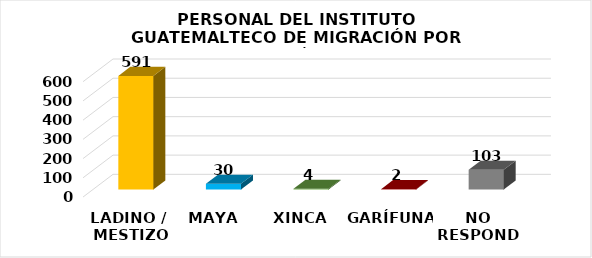
| Category | Series 0 |
|---|---|
| LADINO /
 MESTIZO | 591 |
| MAYA | 30 |
| XINCA | 4 |
| GARÍFUNA | 2 |
| NO RESPONDE | 103 |